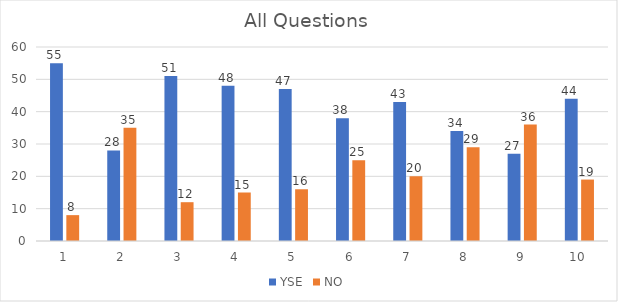
| Category | YSE | NO |
|---|---|---|
| 0 | 55 | 8 |
| 1 | 28 | 35 |
| 2 | 51 | 12 |
| 3 | 48 | 15 |
| 4 | 47 | 16 |
| 5 | 38 | 25 |
| 6 | 43 | 20 |
| 7 | 34 | 29 |
| 8 | 27 | 36 |
| 9 | 44 | 19 |